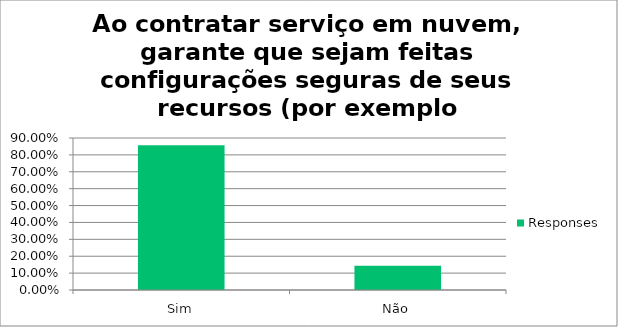
| Category | Responses |
|---|---|
| Sim | 0.857 |
| Não | 0.143 |